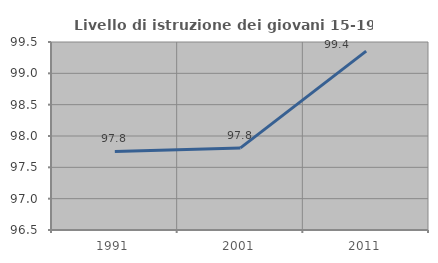
| Category | Livello di istruzione dei giovani 15-19 anni |
|---|---|
| 1991.0 | 97.753 |
| 2001.0 | 97.81 |
| 2011.0 | 99.355 |